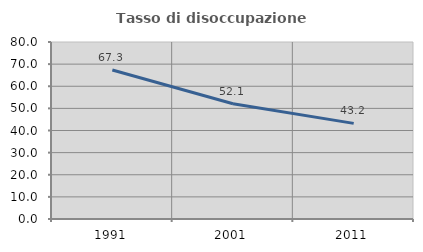
| Category | Tasso di disoccupazione giovanile  |
|---|---|
| 1991.0 | 67.333 |
| 2001.0 | 52.078 |
| 2011.0 | 43.226 |